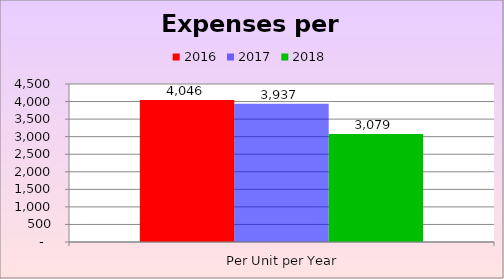
| Category | 2016 | 2017 | 2018 |
|---|---|---|---|
|   Per Unit per Year | 4046.014 | 3936.918 | 3079.278 |